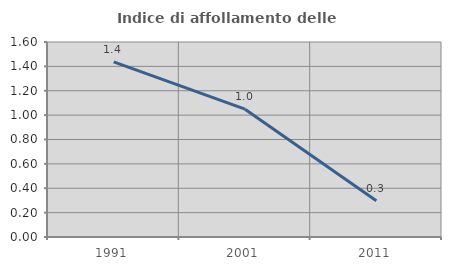
| Category | Indice di affollamento delle abitazioni  |
|---|---|
| 1991.0 | 1.436 |
| 2001.0 | 1.049 |
| 2011.0 | 0.298 |